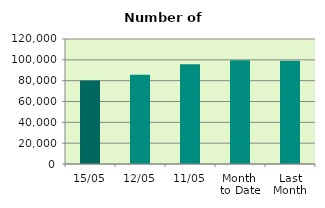
| Category | Series 0 |
|---|---|
| 15/05 | 80092 |
| 12/05 | 85716 |
| 11/05 | 95762 |
| Month 
to Date | 99704.8 |
| Last
Month | 99222.444 |